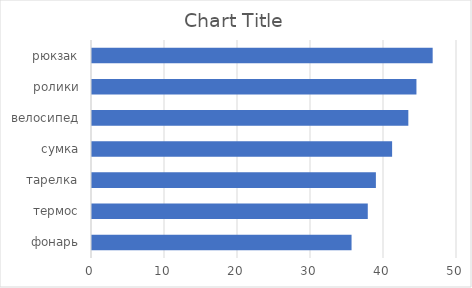
| Category | Series 1 |
|---|---|
| фонарь | 42 |
| термос | 42 |
| тарелка | 42 |
| сумка | 42 |
| велосипед | 42 |
| ролики | 42 |
| рюкзак | 42 |